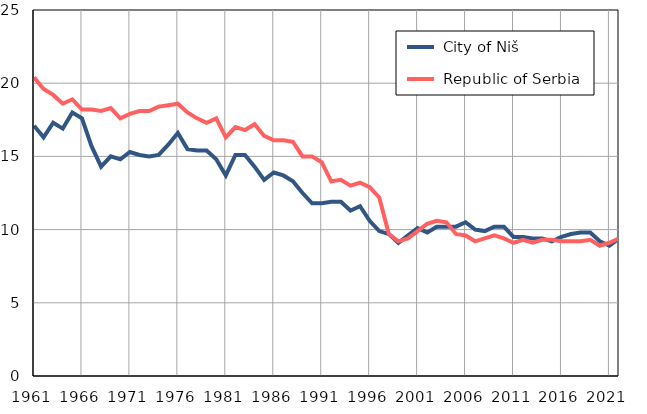
| Category |  City of Niš |  Republic of Serbia |
|---|---|---|
| 1961.0 | 17.1 | 20.4 |
| 1962.0 | 16.3 | 19.6 |
| 1963.0 | 17.3 | 19.2 |
| 1964.0 | 16.9 | 18.6 |
| 1965.0 | 18 | 18.9 |
| 1966.0 | 17.6 | 18.2 |
| 1967.0 | 15.7 | 18.2 |
| 1968.0 | 14.3 | 18.1 |
| 1969.0 | 15 | 18.3 |
| 1970.0 | 14.8 | 17.6 |
| 1971.0 | 15.3 | 17.9 |
| 1972.0 | 15.1 | 18.1 |
| 1973.0 | 15 | 18.1 |
| 1974.0 | 15.1 | 18.4 |
| 1975.0 | 15.8 | 18.5 |
| 1976.0 | 16.6 | 18.6 |
| 1977.0 | 15.5 | 18 |
| 1978.0 | 15.4 | 17.6 |
| 1979.0 | 15.4 | 17.3 |
| 1980.0 | 14.8 | 17.6 |
| 1981.0 | 13.7 | 16.3 |
| 1982.0 | 15.1 | 17 |
| 1983.0 | 15.1 | 16.8 |
| 1984.0 | 14.3 | 17.2 |
| 1985.0 | 13.4 | 16.4 |
| 1986.0 | 13.9 | 16.1 |
| 1987.0 | 13.7 | 16.1 |
| 1988.0 | 13.3 | 16 |
| 1989.0 | 12.5 | 15 |
| 1990.0 | 11.8 | 15 |
| 1991.0 | 11.8 | 14.6 |
| 1992.0 | 11.9 | 13.3 |
| 1993.0 | 11.9 | 13.4 |
| 1994.0 | 11.3 | 13 |
| 1995.0 | 11.6 | 13.2 |
| 1996.0 | 10.6 | 12.9 |
| 1997.0 | 9.9 | 12.2 |
| 1998.0 | 9.7 | 9.7 |
| 1999.0 | 9.1 | 9.2 |
| 2000.0 | 9.6 | 9.4 |
| 2001.0 | 10.1 | 9.9 |
| 2002.0 | 9.8 | 10.4 |
| 2003.0 | 10.2 | 10.6 |
| 2004.0 | 10.2 | 10.5 |
| 2005.0 | 10.2 | 9.7 |
| 2006.0 | 10.5 | 9.6 |
| 2007.0 | 10 | 9.2 |
| 2008.0 | 9.9 | 9.4 |
| 2009.0 | 10.2 | 9.6 |
| 2010.0 | 10.2 | 9.4 |
| 2011.0 | 9.5 | 9.1 |
| 2012.0 | 9.5 | 9.3 |
| 2013.0 | 9.4 | 9.1 |
| 2014.0 | 9.4 | 9.3 |
| 2015.0 | 9.2 | 9.3 |
| 2016.0 | 9.5 | 9.2 |
| 2017.0 | 9.7 | 9.2 |
| 2018.0 | 9.8 | 9.2 |
| 2019.0 | 9.8 | 9.3 |
| 2020.0 | 9.2 | 8.9 |
| 2021.0 | 8.9 | 9.1 |
| 2022.0 | 9.4 | 9.4 |